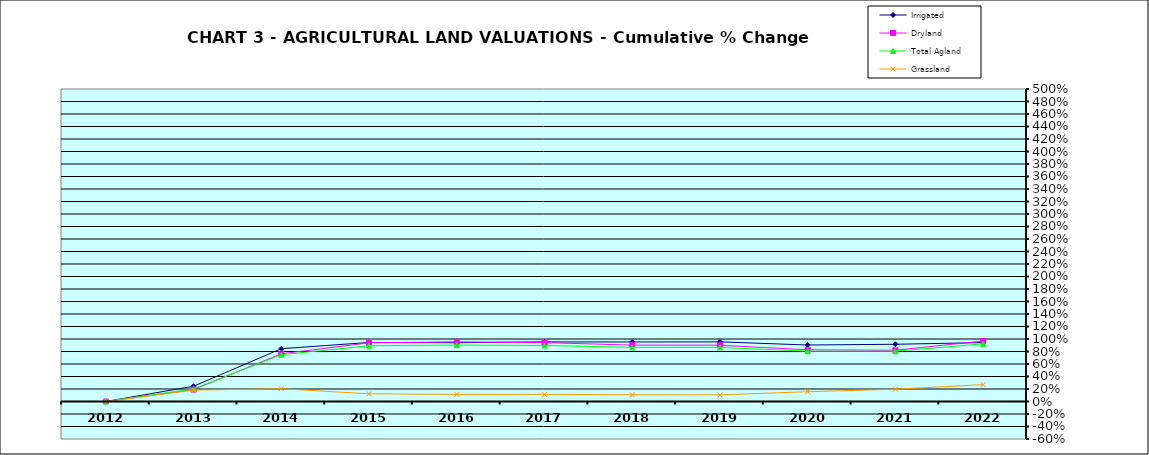
| Category | Irrigated | Dryland | Total Agland | Grassland |
|---|---|---|---|---|
| 2012.0 | 0 | 0 | 0 | 0 |
| 2013.0 | 0.245 | 0.191 | 0.201 | 0.182 |
| 2014.0 | 0.845 | 0.764 | 0.749 | 0.204 |
| 2015.0 | 0.944 | 0.939 | 0.893 | 0.123 |
| 2016.0 | 0.94 | 0.955 | 0.903 | 0.113 |
| 2017.0 | 0.954 | 0.942 | 0.897 | 0.115 |
| 2018.0 | 0.952 | 0.902 | 0.866 | 0.108 |
| 2019.0 | 0.954 | 0.901 | 0.866 | 0.106 |
| 2020.0 | 0.904 | 0.827 | 0.804 | 0.157 |
| 2021.0 | 0.916 | 0.82 | 0.804 | 0.196 |
| 2022.0 | 0.942 | 0.967 | 0.923 | 0.27 |